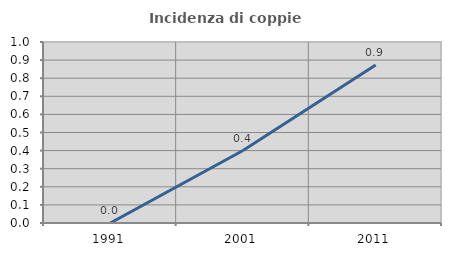
| Category | Incidenza di coppie miste |
|---|---|
| 1991.0 | 0 |
| 2001.0 | 0.401 |
| 2011.0 | 0.873 |